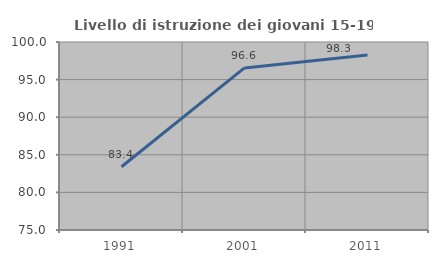
| Category | Livello di istruzione dei giovani 15-19 anni |
|---|---|
| 1991.0 | 83.412 |
| 2001.0 | 96.552 |
| 2011.0 | 98.263 |